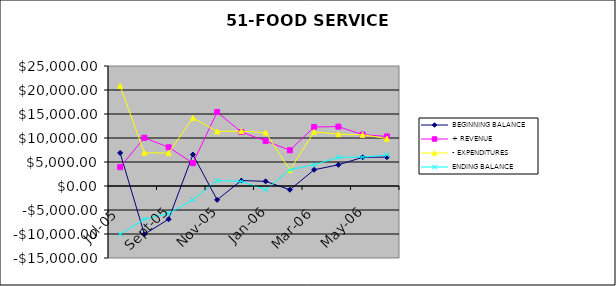
| Category | BEGINNING BALANCE | + REVENUE | - EXPENDITURES | ENDING BALANCE |
|---|---|---|---|---|
| 2005-07-01 | 6887.46 | 3925.27 | 20861.18 | -10048.45 |
| 2005-08-01 | -10048.45 | 10050 | 6926.27 | -6924.72 |
| 2005-09-01 | -6924.72 | 8064.18 | 6865.42 | -5725.96 |
| 2005-10-01 | 6548.92 | 4763.3 | 14202.42 | -2890.2 |
| 2005-11-01 | -2890.2 | 15405.64 | 11372.55 | 1142.89 |
| 2005-12-01 | 1142.89 | 11242.21 | 11420.55 | 964.55 |
| 2006-01-01 | 964.55 | 9394.46 | 11134.21 | -775.2 |
| 2006-02-01 | -775.2 | 7452.05 | 3292.09 | 3384.76 |
| 2006-03-01 | 3384.76 | 12301.31 | 11277.88 | 4408.19 |
| 2006-04-01 | 4408.19 | 12367.1 | 10794.29 | 5981 |
| 2006-05-01 | 5981 | 10709.25 | 10677.49 | 6012.76 |
| 2006-06-01 | 6012.76 | 10323.41 | 9869.68 | 6466.49 |